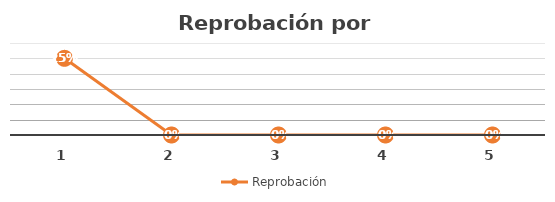
| Category | Reprobación |
|---|---|
| 0 | 0.25 |
| 1 | 0 |
| 2 | 0 |
| 3 | 0 |
| 4 | 0 |